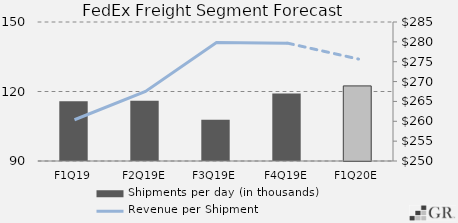
| Category | Shipments per day (in thousands) |
|---|---|
|  F1Q19  | 115.745 |
|  F2Q19E  | 116.019 |
|  F3Q19E  | 107.774 |
|  F4Q19E  | 119.117 |
|  F1Q20E  | 122.416 |